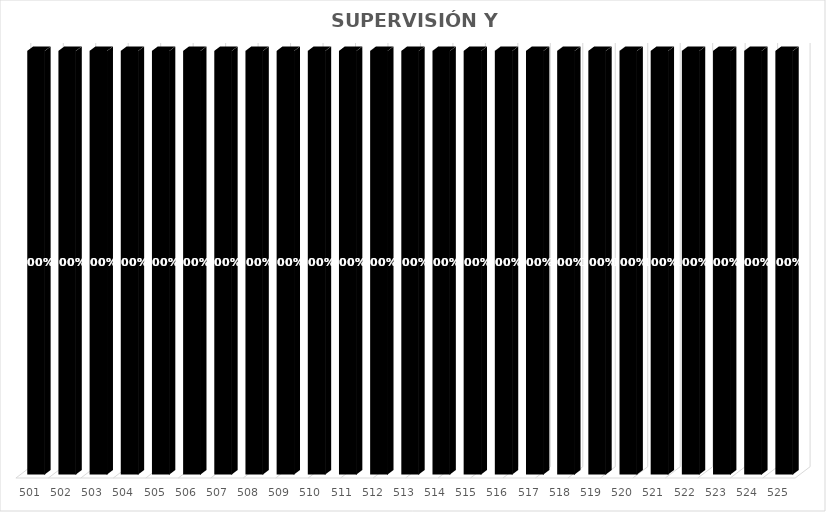
| Category | % Avance |
|---|---|
| 501.0 | 1 |
| 502.0 | 1 |
| 503.0 | 1 |
| 504.0 | 1 |
| 505.0 | 1 |
| 506.0 | 1 |
| 507.0 | 1 |
| 508.0 | 1 |
| 509.0 | 1 |
| 510.0 | 1 |
| 511.0 | 1 |
| 512.0 | 1 |
| 513.0 | 1 |
| 514.0 | 1 |
| 515.0 | 1 |
| 516.0 | 1 |
| 517.0 | 1 |
| 518.0 | 1 |
| 519.0 | 1 |
| 520.0 | 1 |
| 521.0 | 1 |
| 522.0 | 1 |
| 523.0 | 1 |
| 524.0 | 1 |
| 525.0 | 1 |